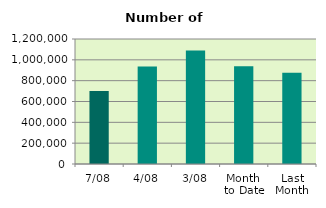
| Category | Series 0 |
|---|---|
| 7/08 | 701624 |
| 4/08 | 935934 |
| 3/08 | 1089720 |
| Month 
to Date | 938702.4 |
| Last
Month | 877151.619 |